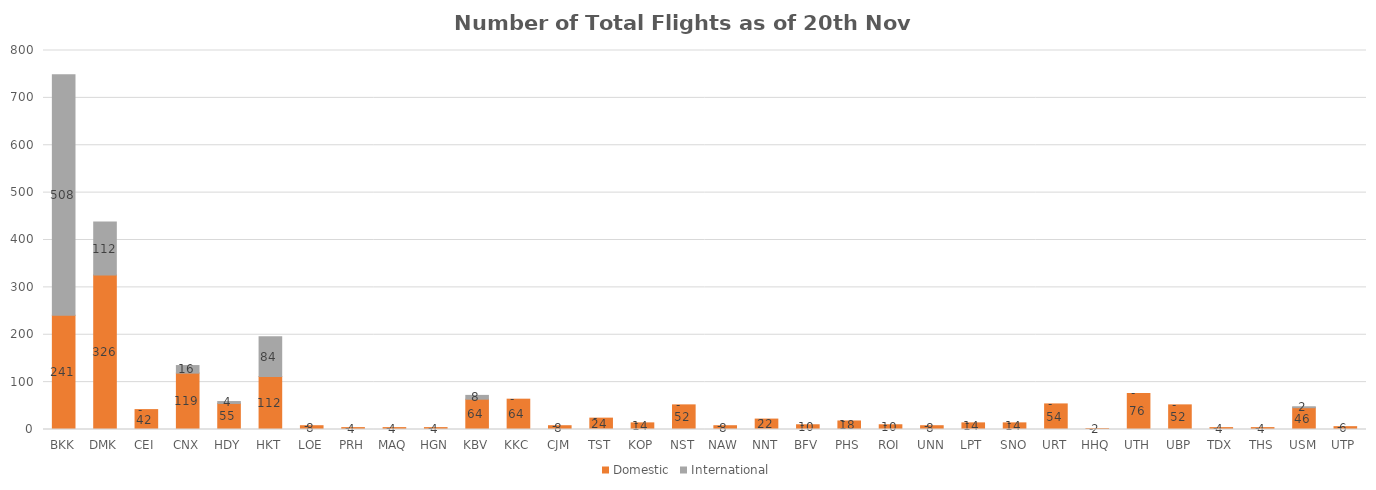
| Category | Domestic | International |
|---|---|---|
| BKK | 241 | 508 |
| DMK | 326 | 112 |
| CEI | 42 | 0 |
| CNX | 119 | 16 |
| HDY | 55 | 4 |
| HKT | 112 | 84 |
| LOE | 8 | 0 |
| PRH | 4 | 0 |
| MAQ | 4 | 0 |
| HGN | 4 | 0 |
| KBV | 64 | 8 |
| KKC | 64 | 0 |
| CJM | 8 | 0 |
| TST | 24 | 0 |
| KOP | 14 | 0 |
| NST | 52 | 0 |
| NAW | 8 | 0 |
| NNT | 22 | 0 |
| BFV | 10 | 0 |
| PHS | 18 | 0 |
| ROI | 10 | 0 |
| UNN | 8 | 0 |
| LPT | 14 | 0 |
| SNO | 14 | 0 |
| URT | 54 | 0 |
| HHQ | 2 | 0 |
| UTH | 76 | 0 |
| UBP | 52 | 0 |
| TDX | 4 | 0 |
| THS | 4 | 0 |
| USM | 46 | 2 |
| UTP | 6 | 0 |